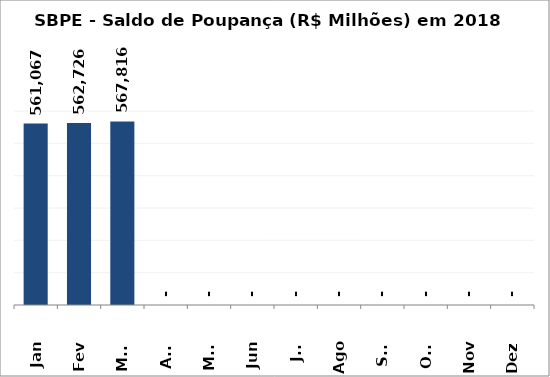
| Category | SBPE - Saldo de Poupança (R$ Milhões) em 2018 |
|---|---|
| Jan | 561067.029 |
| Fev | 562726.35 |
| Mar | 567815.814 |
| Abr | 0 |
| Mai | 0 |
| Jun | 0 |
| Jul | 0 |
| Ago | 0 |
| Set | 0 |
| Out | 0 |
| Nov | 0 |
| Dez | 0 |